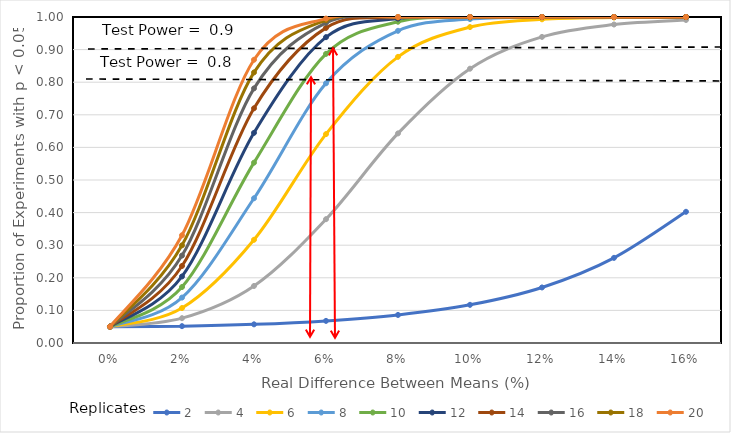
| Category | 2 | 4 | 6 | 8 | 10 | 12 | 14 | 16 | 18 | 20 |
|---|---|---|---|---|---|---|---|---|---|---|
| 0.0 | 0.05 | 0.05 | 0.05 | 0.05 | 0.05 | 0.05 | 0.05 | 0.05 | 0.05 | 0.05 |
| 0.02 | 0.052 | 0.076 | 0.107 | 0.139 | 0.172 | 0.204 | 0.236 | 0.268 | 0.3 | 0.33 |
| 0.04 | 0.057 | 0.175 | 0.317 | 0.444 | 0.553 | 0.645 | 0.72 | 0.781 | 0.83 | 0.869 |
| 0.06 | 0.068 | 0.38 | 0.641 | 0.797 | 0.887 | 0.938 | 0.967 | 0.982 | 0.991 | 0.995 |
| 0.08 | 0.086 | 0.643 | 0.878 | 0.958 | 0.985 | 0.995 | 0.998 | 0.999 | 1 | 1 |
| 0.1 | 0.117 | 0.841 | 0.969 | 0.994 | 0.999 | 1 | 1 | 1 | 1 | 1 |
| 0.12 | 0.17 | 0.939 | 0.993 | 0.999 | 1 | 1 | 1 | 1 | 1 | 1 |
| 0.14 | 0.261 | 0.977 | 0.998 | 1 | 1 | 1 | 1 | 1 | 1 | 1 |
| 0.16 | 0.402 | 0.991 | 1 | 1 | 1 | 1 | 1 | 1 | 1 | 1 |